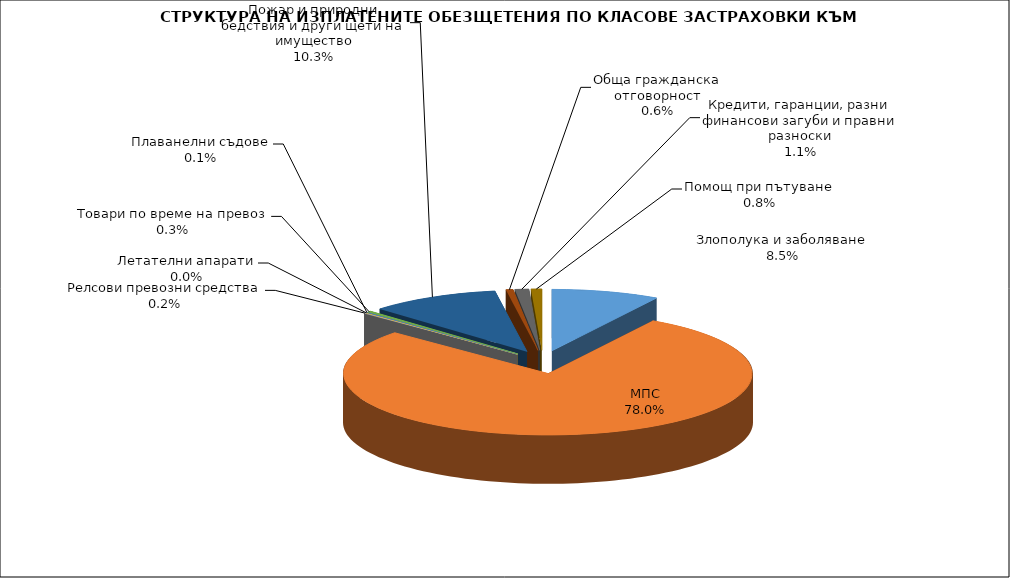
| Category | Злополука и заболяване |
|---|---|
| Злополука и заболяване | 0.085 |
| МПС | 0.78 |
| Релсови превозни средства | 0.002 |
| Летателни апарати | 0 |
| Плаванелни съдове | 0.001 |
| Товари по време на превоз | 0.003 |
| Пожар и природни бедствия и други щети на имущество | 0.103 |
| Обща гражданска отговорност | 0.006 |
| Кредити, гаранции, разни финансови загуби и правни разноски | 0.011 |
| Помощ при пътуване | 0.008 |